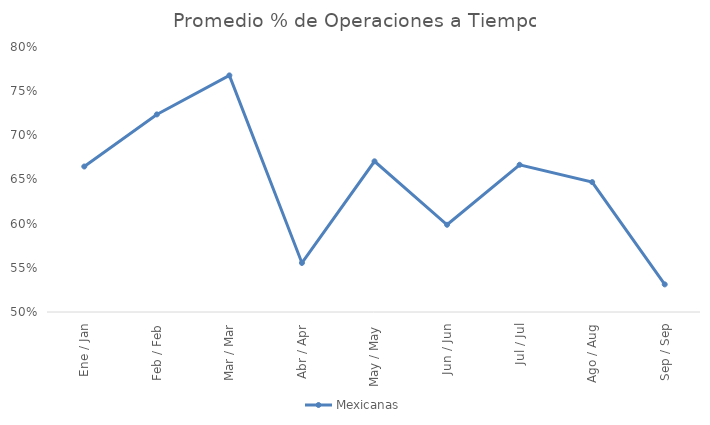
| Category | Mexicanas |
|---|---|
| Ene / Jan | 0.665 |
| Feb / Feb | 0.724 |
| Mar / Mar | 0.768 |
| Abr / Apr | 0.556 |
| May / May | 0.671 |
| Jun / Jun | 0.599 |
| Jul / Jul | 0.667 |
| Ago / Aug | 0.647 |
| Sep / Sep | 0.531 |